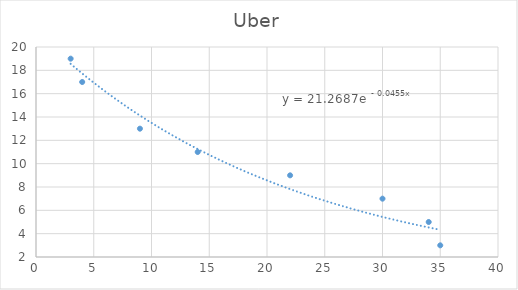
| Category | Uber |
|---|---|
| 35.0 | 3 |
| 34.0 | 5 |
| 30.0 | 7 |
| 22.0 | 9 |
| 14.0 | 11 |
| 9.0 | 13 |
| 4.0 | 17 |
| 3.0 | 19 |